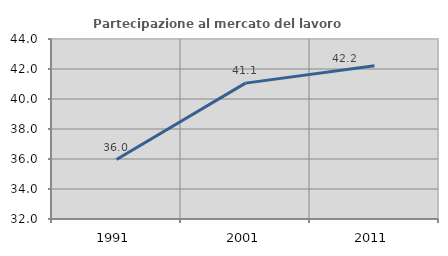
| Category | Partecipazione al mercato del lavoro  femminile |
|---|---|
| 1991.0 | 35.966 |
| 2001.0 | 41.058 |
| 2011.0 | 42.215 |